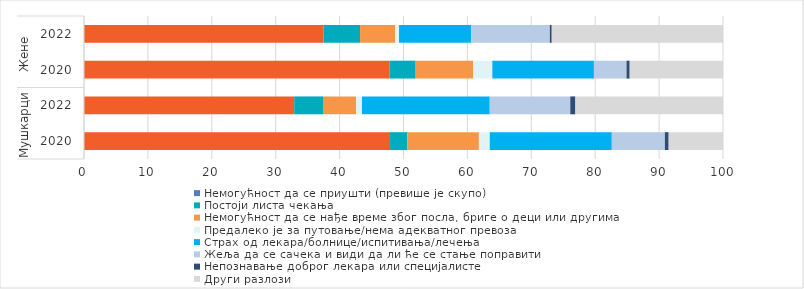
| Category | Немогућност да се приушти (превише је скупо) | Постоји листа чекања | Немогућност да се нађе време због посла, бриге о деци или другима | Предалеко је за путовање/нема адекватног превоза | Страх од лекара/болнице/испитивања/лечења | Жеља да се сачека и види да ли ће се стање поправити | Непознавање доброг лекара или специјалисте | Други разлози |
|---|---|---|---|---|---|---|---|---|
| 0 | 47.9 | 2.7 | 11.2 | 1.7 | 19.1 | 8.3 | 0.6 | 8.5 |
| 1 | 32.9 | 4.5 | 5.2 | 0.9 | 20 | 12.6 | 0.8 | 23.1 |
| 2 | 47.8 | 4.1 | 9 | 3 | 15.9 | 5.1 | 0.5 | 14.6 |
| 3 | 37.5 | 5.7 | 5.5 | 0.6 | 11.3 | 12.3 | 0.3 | 26.8 |